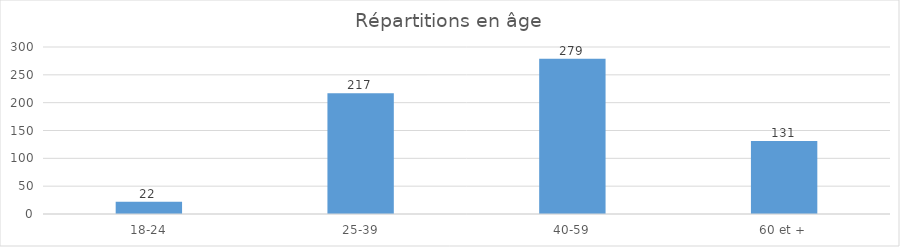
| Category | 18-24 |
|---|---|
| 18-24 | 22 |
| 25-39 | 217 |
| 40-59 | 279 |
| 60 et + | 131 |